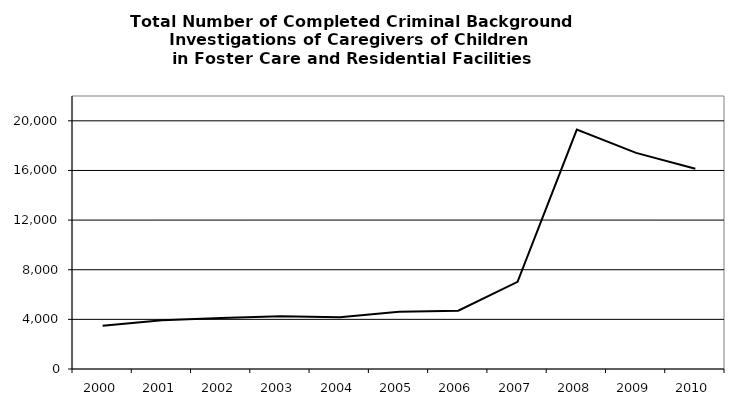
| Category | Children's Residential Facilities |
|---|---|
| 2000.0 | 3480 |
| 2001.0 | 3925 |
| 2002.0 | 4102 |
| 2003.0 | 4241 |
| 2004.0 | 4180 |
| 2005.0 | 4615 |
| 2006.0 | 4696 |
| 2007.0 | 7027 |
| 2008.0 | 19290 |
| 2009.0 | 17414 |
| 2010.0 | 16132 |